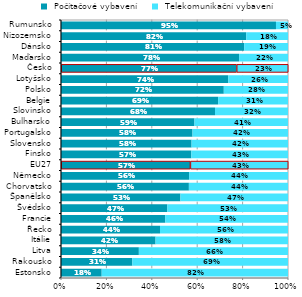
| Category |  Počítačové vybavení |  Telekomunikační vybavení |
|---|---|---|
| Estonsko | 0.179 | 0.821 |
| Rakousko | 0.314 | 0.686 |
| Litva | 0.343 | 0.657 |
| Itálie | 0.417 | 0.583 |
| Řecko | 0.436 | 0.564 |
| Francie | 0.459 | 0.541 |
| Švédsko | 0.469 | 0.531 |
| Španělsko | 0.526 | 0.474 |
| Chorvatsko | 0.563 | 0.437 |
| Německo | 0.564 | 0.436 |
| EU27 | 0.569 | 0.431 |
| Finsko | 0.574 | 0.426 |
| Slovensko | 0.575 | 0.425 |
| Portugalsko | 0.579 | 0.421 |
| Bulharsko | 0.588 | 0.412 |
| Slovinsko | 0.678 | 0.322 |
| Belgie | 0.692 | 0.308 |
| Polsko | 0.717 | 0.283 |
| Lotyšsko | 0.737 | 0.263 |
| Česko | 0.773 | 0.227 |
| Maďarsko | 0.785 | 0.215 |
| Dánsko | 0.807 | 0.193 |
| Nizozemsko | 0.816 | 0.184 |
| Rumunsko | 0.947 | 0.053 |